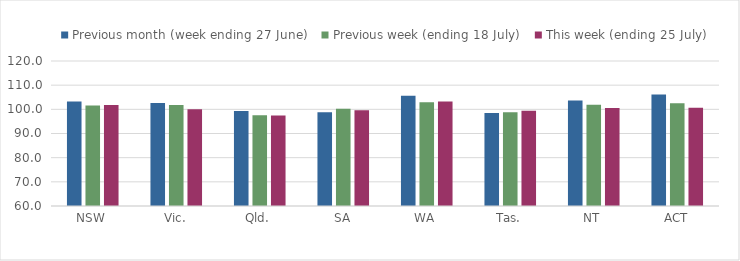
| Category | Previous month (week ending 27 June) | Previous week (ending 18 July) | This week (ending 25 July) |
|---|---|---|---|
| NSW | 103.197 | 101.569 | 101.755 |
| Vic. | 102.661 | 101.839 | 100.019 |
| Qld. | 99.324 | 97.562 | 97.438 |
| SA | 98.845 | 100.237 | 99.59 |
| WA | 105.632 | 102.967 | 103.227 |
| Tas. | 98.51 | 98.806 | 99.399 |
| NT | 103.653 | 101.895 | 100.603 |
| ACT | 106.143 | 102.518 | 100.627 |